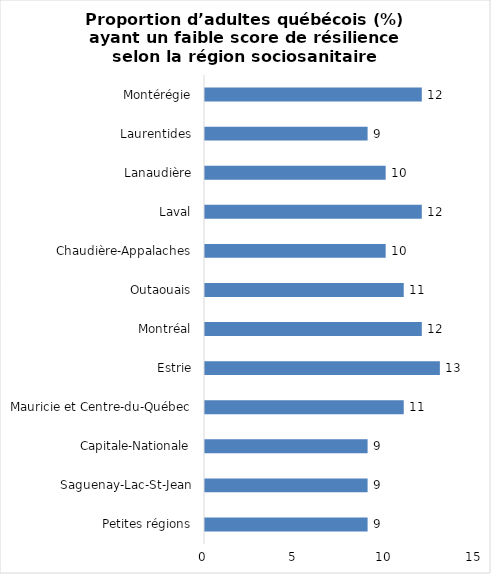
| Category | Series 0 |
|---|---|
| Petites régions | 9 |
| Saguenay-Lac-St-Jean | 9 |
| Capitale-Nationale | 9 |
| Mauricie et Centre-du-Québec | 11 |
| Estrie | 13 |
| Montréal | 12 |
| Outaouais | 11 |
| Chaudière-Appalaches | 10 |
| Laval | 12 |
| Lanaudière | 10 |
| Laurentides | 9 |
| Montérégie | 12 |